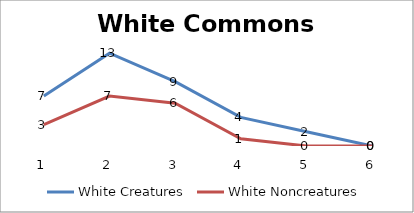
| Category | White Creatures | White Noncreatures |
|---|---|---|
| 0 | 7 | 3 |
| 1 | 13 | 7 |
| 2 | 9 | 6 |
| 3 | 4 | 1 |
| 4 | 2 | 0 |
| 5 | 0 | 0 |